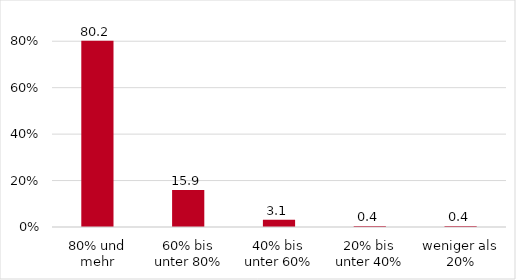
| Category | Series 0 |
|---|---|
| 80% und mehr | 80.23 |
| 60% bis unter 80% | 15.931 |
| 40% bis unter 60% | 3.071 |
| 20% bis unter 40% | 0.384 |
| weniger als 20% | 0.384 |